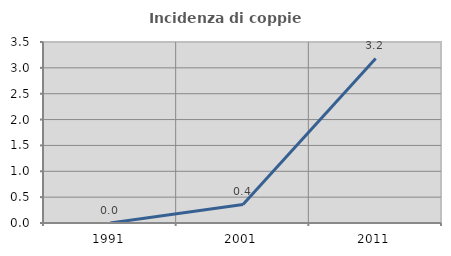
| Category | Incidenza di coppie miste |
|---|---|
| 1991.0 | 0 |
| 2001.0 | 0.36 |
| 2011.0 | 3.183 |